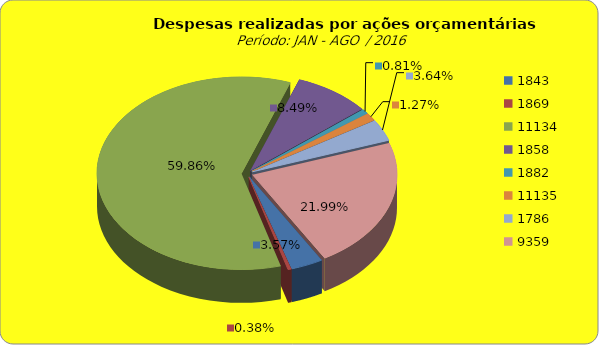
| Category | Series 1 |
|---|---|
| 1843.0 | 5874074.72 |
| 1869.0 | 633123.27 |
| 11134.0 | 98569763.74 |
| 1858.0 | 13973867.69 |
| 1882.0 | 1326303.92 |
| 11135.0 | 2090018.36 |
| 1786.0 | 5990786.79 |
| 9359.0 | 36205603.5 |